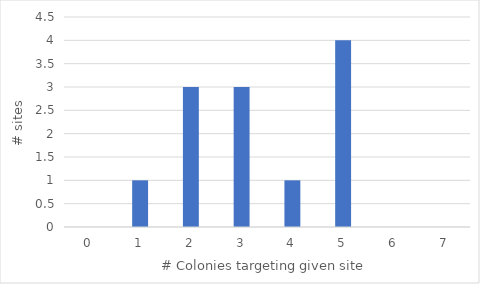
| Category | # Sites |
|---|---|
| 0.0 | 0 |
| 1.0 | 1 |
| 2.0 | 3 |
| 3.0 | 3 |
| 4.0 | 1 |
| 5.0 | 4 |
| 6.0 | 0 |
| 7.0 | 0 |